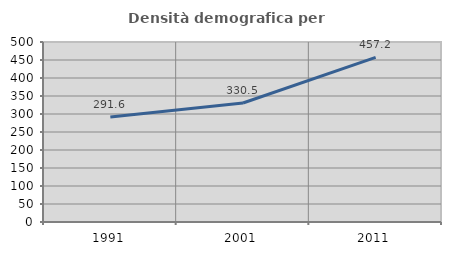
| Category | Densità demografica |
|---|---|
| 1991.0 | 291.639 |
| 2001.0 | 330.505 |
| 2011.0 | 457.196 |